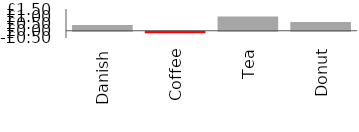
| Category | Item margin |
|---|---|
| Danish | 0.39 |
| Coffee | -0.1 |
| Tea | 0.98 |
| Donut | 0.61 |